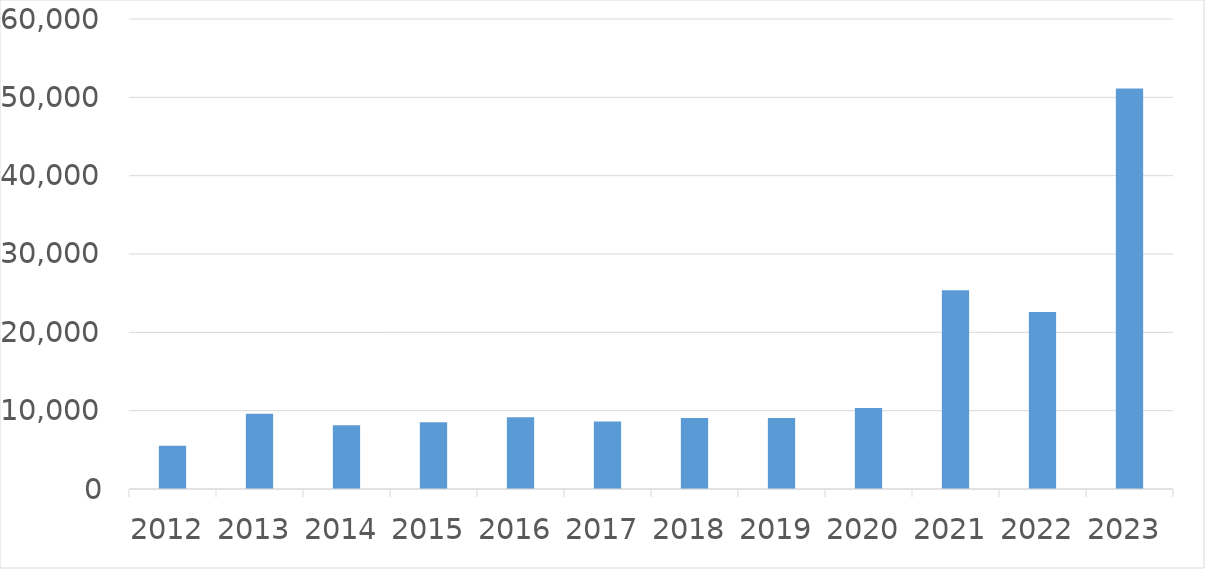
| Category | Series 0 |
|---|---|
| 2012 | 5536 |
| 2013 | 9615 |
| 2014 | 8126 |
| 2015 | 8535 |
| 2016 | 9171 |
| 2017 | 8603 |
| 2018 | 9048 |
| 2019 | 9054 |
| 2020 | 10332 |
| 2021 | 25382 |
| 2022 | 22595 |
| 2023 | 51134 |